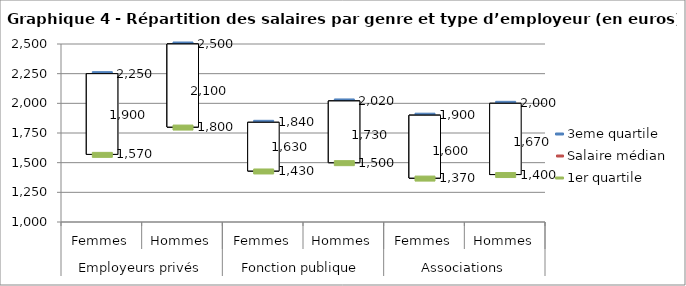
| Category | 3eme quartile | Salaire médian | 1er quartile |
|---|---|---|---|
| 0 | 2250 | 1900 | 1570 |
| 1 | 2500 | 2100 | 1800 |
| 2 | 1840 | 1630 | 1430 |
| 3 | 2020 | 1730 | 1500 |
| 4 | 1900 | 1600 | 1370 |
| 5 | 2000 | 1670 | 1400 |